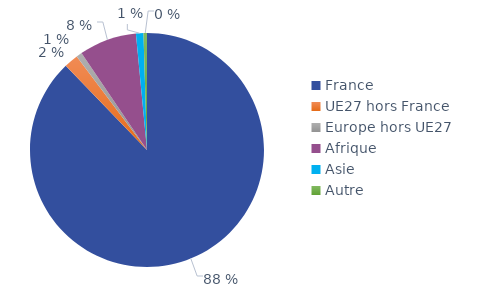
| Category | Series 0 |
|---|---|
| France | 0.878 |
| UE27 hors France | 0.02 |
| Europe hors UE27 | 0.008 |
| Afrique | 0.08 |
| Asie | 0.01 |
| Autre | 0.005 |